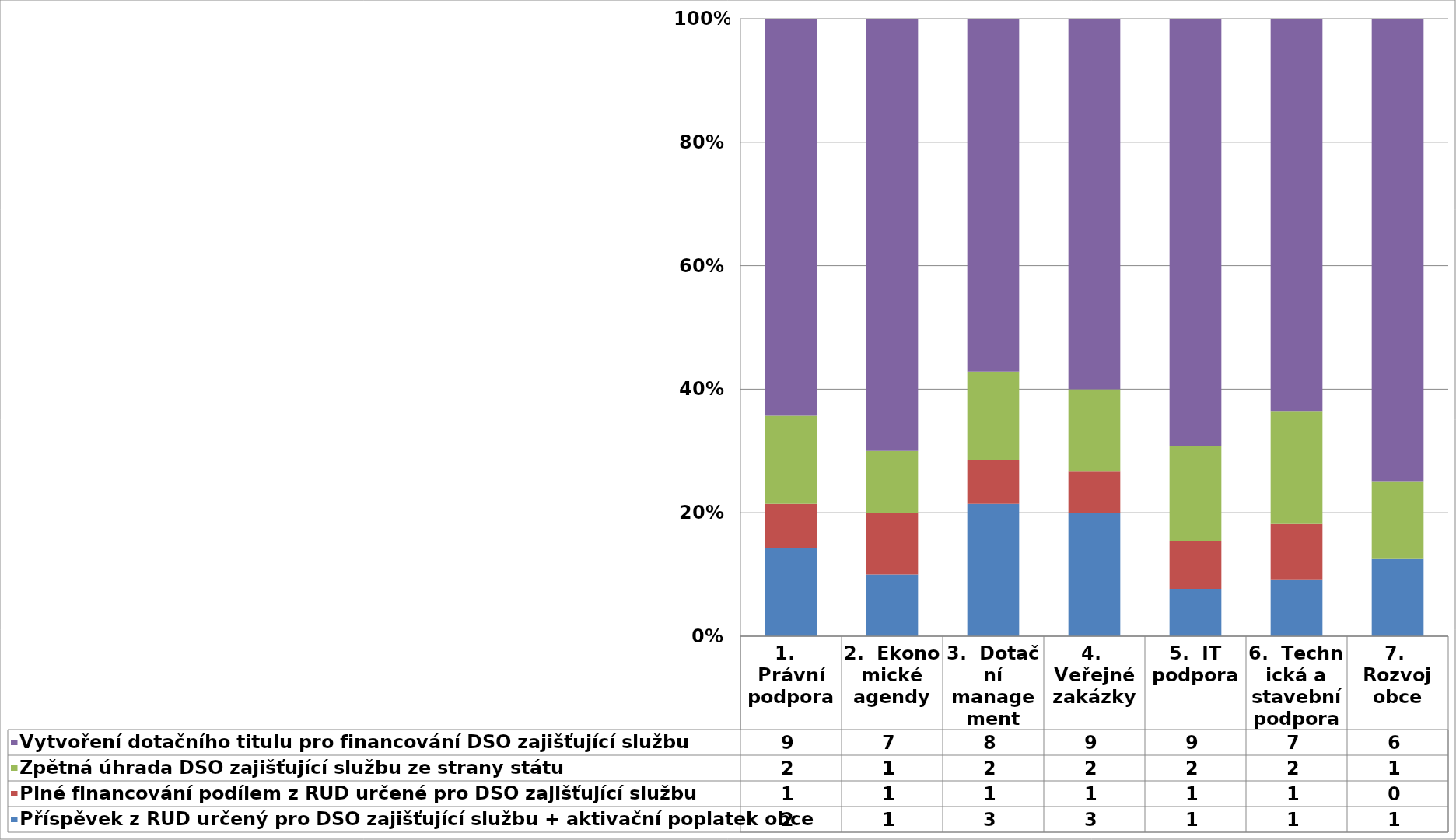
| Category | Příspěvek z RUD určený pro DSO zajišťující službu + aktivační poplatek obce | Plné financování podílem z RUD určené pro DSO zajišťující službu  | Zpětná úhrada DSO zajišťující službu ze strany státu | Vytvoření dotačního titulu pro financování DSO zajišťující službu |
|---|---|---|---|---|
| 1.   Právní podpora | 2 | 1 | 2 | 9 |
| 2.  Ekonomické agendy | 1 | 1 | 1 | 7 |
| 3.  Dotační management | 3 | 1 | 2 | 8 |
| 4.  Veřejné zakázky | 3 | 1 | 2 | 9 |
| 5.  IT podpora | 1 | 1 | 2 | 9 |
| 6.  Technická a stavební podpora | 1 | 1 | 2 | 7 |
| 7.  Rozvoj obce | 1 | 0 | 1 | 6 |